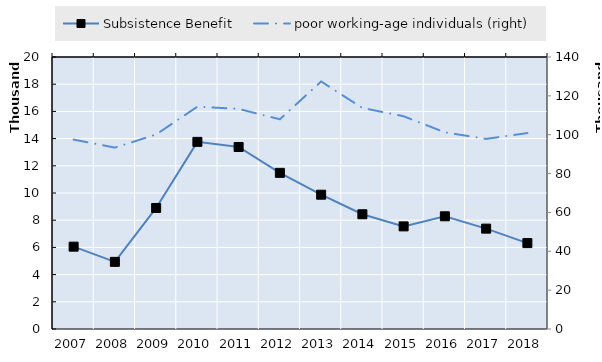
| Category | Subsistence Benefit | 0 | Series 14 | Series 15 | Series 16 | Series 17 | Series 18 |
|---|---|---|---|---|---|---|---|
| 2007.0 | 6053.6 |  |  |  |  |  |  |
| 2008.0 | 4936.1 |  |  |  |  |  |  |
| 2009.0 | 8899.142 |  |  |  |  |  |  |
| 2010.0 | 13760 |  |  |  |  |  |  |
| 2011.0 | 13382.6 |  |  |  |  |  |  |
| 2012.0 | 11481.167 |  |  |  |  |  |  |
| 2013.0 | 9874 |  |  |  |  |  |  |
| 2014.0 | 8437.333 |  |  |  |  |  |  |
| 2015.0 | 7545.917 |  |  |  |  |  |  |
| 2016.0 | 8287.5 |  |  |  |  |  |  |
| 2017.0 | 7379.4 |  |  |  |  |  |  |
| 2018.0 | 6316.767 |  |  |  |  |  |  |